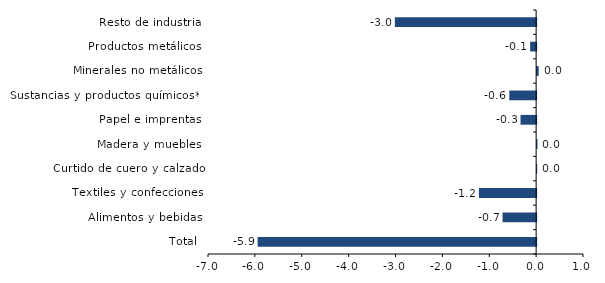
| Category | Series 0 |
|---|---|
| Total | -5.941 |
| Alimentos y bebidas | -0.716 |
| Textiles y confecciones | -1.22 |
| Curtido de cuero y calzado | 0.001 |
| Madera y muebles | 0.007 |
| Papel e imprentas | -0.333 |
| Sustancias y productos químicos** | -0.572 |
| Minerales no metálicos | 0.033 |
| Productos metálicos | -0.128 |
| Resto de industria | -3.013 |